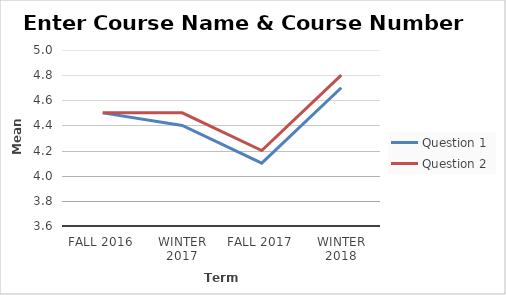
| Category | Question 1 | Question 2 |
|---|---|---|
| Fall 2016 | 4.5 | 4.5 |
| Winter 2017 | 4.4 | 4.5 |
| Fall 2017 | 4.1 | 4.2 |
| Winter 2018 | 4.7 | 4.8 |